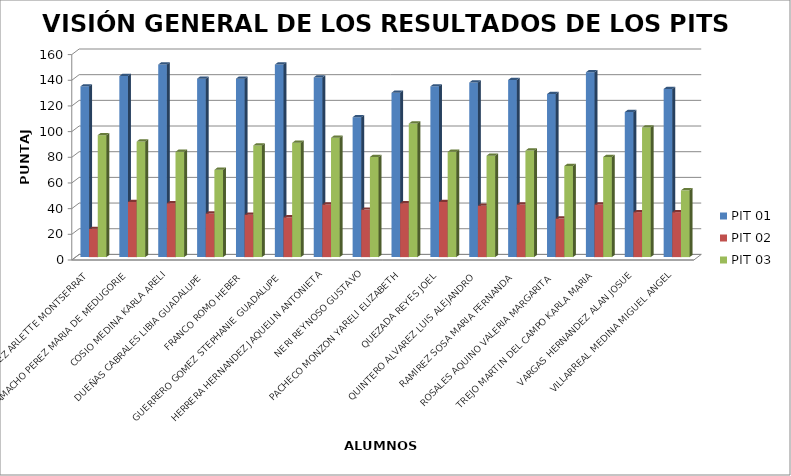
| Category | PIT 01 | PIT 02 | PIT 03 |
|---|---|---|---|
| ALCALA RODRIGUEZ ARLETTE MONTSERRAT | 133 | 22 | 95 |
| CAMACHO PEREZ MARIA DE MEDUGORIE | 141 | 43 | 90 |
| COSIO MEDINA KARLA ARELI | 150 | 42 | 82 |
| DUEÑAS CABRALES LIBIA GUADALUPE | 139 | 34 | 68 |
| FRANCO ROMO HEBER | 139 | 33 | 87 |
| GUERRERO GOMEZ STEPHANIE GUADALUPE | 150 | 31 | 89 |
| HERRERA HERNANDEZ JAQUELIN ANTONIETA | 140 | 41 | 93 |
| NERI REYNOSO GUSTAVO | 109 | 37 | 78 |
| PACHECO MONZON YARELI ELIZABETH | 128 | 42 | 104 |
| QUEZADA REYES JOEL | 133 | 43 | 82 |
| QUINTERO ALVAREZ LUIS ALEJANDRO | 136 | 40 | 79 |
| RAMIREZ SOSA MARIA FERNANDA | 138 | 41 | 83 |
| ROSALES AQUINO VALERIA MARGARITA | 127 | 30 | 71 |
| TREJO MARTIN DEL CAMPO KARLA MARIA | 144 | 41 | 78 |
| VARGAS HERNANDEZ ALAN JOSUE | 113 | 35 | 101 |
| VILLARREAL MEDINA MIGUEL ANGEL | 131 | 35 | 52 |